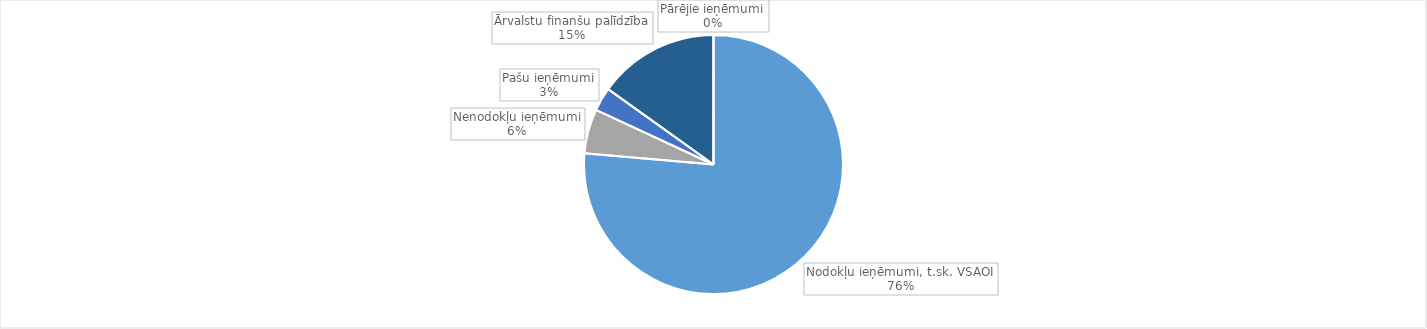
| Category | Series 0 |
|---|---|
| Nodokļu ieņēmumi, t.sk. VSAOI | 1063867.001 |
| Nenodokļu ieņēmumi | 77237.089 |
| Pašu ieņēmumi | 41230.322 |
| Ārvalstu finanšu palīdzība | 210513.092 |
| Pārējie ieņēmumi | 135.924 |